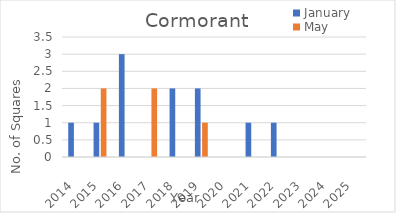
| Category | January | May |
|---|---|---|
| 2014.0 | 1 | 0 |
| 2015.0 | 1 | 2 |
| 2016.0 | 3 | 0 |
| 2017.0 | 0 | 2 |
| 2018.0 | 2 | 0 |
| 2019.0 | 2 | 1 |
| 2020.0 | 0 | 0 |
| 2021.0 | 1 | 0 |
| 2022.0 | 1 | 0 |
| 2023.0 | 0 | 0 |
| 2024.0 | 0 | 0 |
| 2025.0 | 0 | 0 |